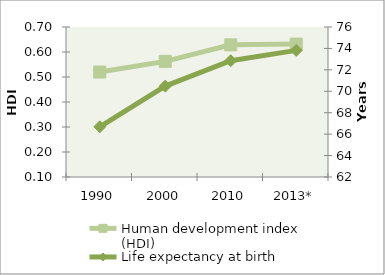
| Category | Human development index (HDI) |
|---|---|
| 1990 | 0.52 |
| 2000 | 0.563 |
| 2010 | 0.629 |
| 2013* | 0.632 |